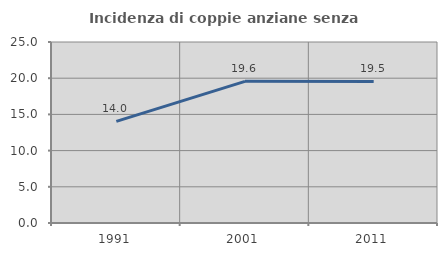
| Category | Incidenza di coppie anziane senza figli  |
|---|---|
| 1991.0 | 14.032 |
| 2001.0 | 19.565 |
| 2011.0 | 19.548 |